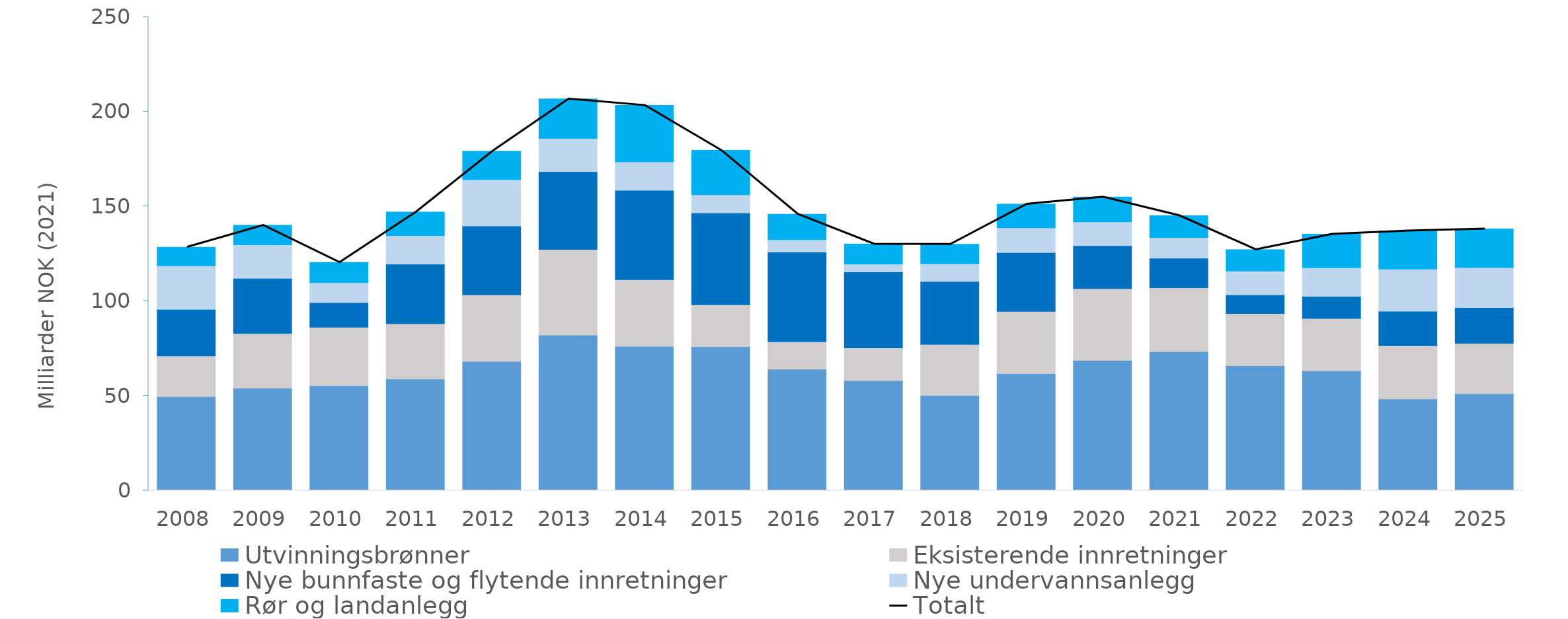
| Category | Utvinningsbrønner | Eksisterende innretninger | Nye bunnfaste og flytende innretninger | Nye undervannsanlegg | Rør og landanlegg |
|---|---|---|---|---|---|
| 2008.0 | 49.567 | 21.442 | 24.59 | 23.072 | 9.741 |
| 2009.0 | 54.009 | 28.922 | 29.044 | 17.761 | 10.244 |
| 2010.0 | 55.353 | 30.83 | 13.045 | 10.534 | 10.584 |
| 2011.0 | 58.868 | 29.162 | 31.506 | 15.036 | 12.407 |
| 2012.0 | 68.156 | 35.168 | 36.314 | 24.491 | 14.892 |
| 2013.0 | 82.002 | 45.304 | 40.987 | 17.515 | 20.849 |
| 2014.0 | 76.103 | 35.179 | 47.174 | 15.045 | 29.733 |
| 2015.0 | 75.918 | 22.12 | 48.452 | 9.647 | 23.394 |
| 2016.0 | 64.028 | 14.534 | 47.344 | 6.509 | 13.456 |
| 2017.0 | 57.928 | 17.423 | 40.032 | 4.119 | 10.554 |
| 2018.0 | 50.246 | 26.929 | 33.177 | 9.308 | 10.321 |
| 2019.0 | 61.69 | 32.861 | 31.059 | 13.073 | 12.497 |
| 2020.0 | 68.667 | 37.915 | 22.731 | 12.475 | 13.114 |
| 2021.0 | 73.326 | 33.714 | 15.621 | 10.868 | 11.505 |
| 2022.0 | 65.932 | 27.514 | 9.853 | 12.542 | 11.254 |
| 2023.0 | 63.196 | 27.616 | 11.707 | 15.094 | 17.695 |
| 2024.0 | 48.338 | 28.069 | 18.223 | 22.221 | 20.176 |
| 2025.0 | 51.121 | 26.57 | 18.894 | 21.125 | 20.337 |